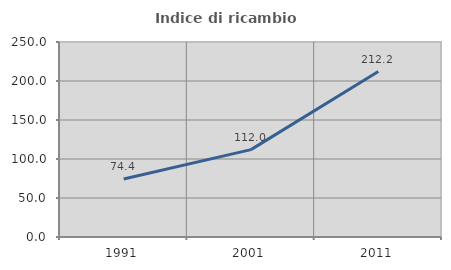
| Category | Indice di ricambio occupazionale  |
|---|---|
| 1991.0 | 74.448 |
| 2001.0 | 112.049 |
| 2011.0 | 212.153 |